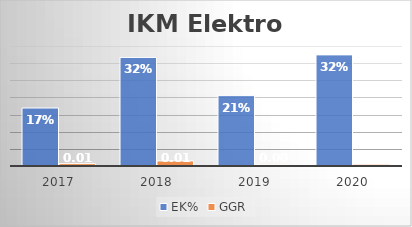
| Category | EK% | GGR |
|---|---|---|
| 2017.0 | 0.169 | 0.007 |
| 2018.0 | 0.317 | 0.015 |
| 2019.0 | 0.205 | 0.004 |
| 2020.0 | 0.324 | 0.005 |